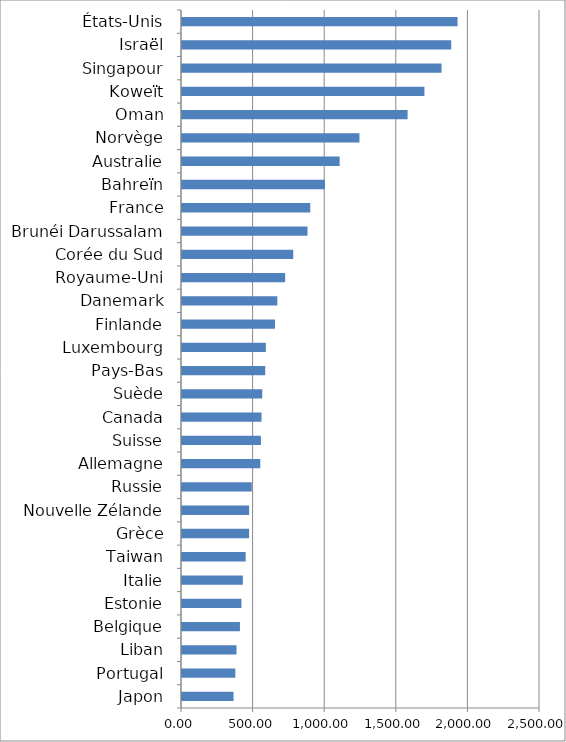
| Category | Series 0 |
|---|---|
| Japon | 359.988 |
| Portugal | 372.494 |
| Liban | 380.545 |
| Belgique | 404.486 |
| Estonie | 415.071 |
| Italie | 425.021 |
| Taiwan | 444.588 |
| Grèce | 468.644 |
| Nouvelle Zélande | 468.74 |
| Russie | 487.286 |
| Allemagne | 546.423 |
| Suisse | 551.057 |
| Canada | 555.367 |
| Suède | 560.456 |
| Pays-Bas | 581.322 |
| Luxembourg | 585.478 |
| Finlande | 649.495 |
| Danemark | 665.59 |
| Royaume-Uni | 720.319 |
| Corée du Sud | 776.712 |
| Brunéi Darussalam | 876.23 |
| France | 895.533 |
| Bahreïn | 998.575 |
| Australie | 1100.913 |
| Norvège | 1239.149 |
| Oman | 1575.53 |
| Koweït | 1692.945 |
| Singapour | 1812.513 |
| Israël | 1880.081 |
| États-Unis | 1924.215 |